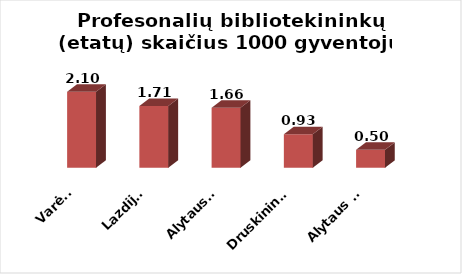
| Category | Series 0 |
|---|---|
| Varėna | 2.103 |
| Lazdijai | 1.712 |
| Alytaus r. | 1.663 |
| Druskininkai | 0.93 |
| Alytaus m. | 0.496 |